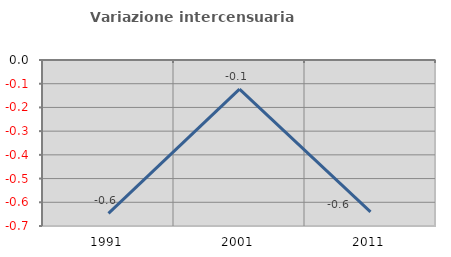
| Category | Variazione intercensuaria annua |
|---|---|
| 1991.0 | -0.647 |
| 2001.0 | -0.123 |
| 2011.0 | -0.641 |